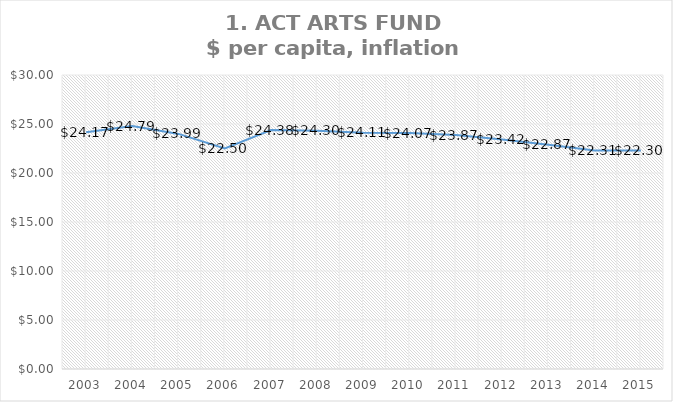
| Category | ACT ARTS FUND
$ Per Capita, inflation adjusted |
|---|---|
| 2003.0 | 24.168 |
| 2004.0 | 24.787 |
| 2005.0 | 23.989 |
| 2006.0 | 22.496 |
| 2007.0 | 24.382 |
| 2008.0 | 24.303 |
| 2009.0 | 24.11 |
| 2010.0 | 24.074 |
| 2011.0 | 23.872 |
| 2012.0 | 23.421 |
| 2013.0 | 22.873 |
| 2014.0 | 22.305 |
| 2015.0 | 22.296 |